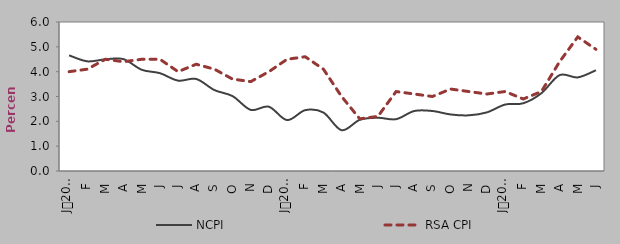
| Category | NCPI | RSA CPI |
|---|---|---|
| 0 | 4.658 | 4 |
| 1900-01-01 | 4.416 | 4.1 |
| 1900-01-02 | 4.498 | 4.5 |
| 1900-01-03 | 4.503 | 4.4 |
| 1900-01-04 | 4.076 | 4.5 |
| 1900-01-05 | 3.939 | 4.5 |
| 1900-01-06 | 3.639 | 4 |
| 1900-01-07 | 3.705 | 4.3 |
| 1900-01-08 | 3.259 | 4.1 |
| 1900-01-09 | 3.015 | 3.7 |
| 1900-01-10 | 2.461 | 3.6 |
| 1900-01-11 | 2.588 | 4 |
| 1900-01-12 | 2.05 | 4.5 |
| 1900-01-13 | 2.45 | 4.6 |
| 1900-01-14 | 2.354 | 4.1 |
| 1900-01-15 | 1.643 | 3 |
| 1900-01-16 | 2.06 | 2.1 |
| 1900-01-17 | 2.145 | 2.2 |
| 1900-01-18 | 2.087 | 3.2 |
| 1900-01-19 | 2.416 | 3.1 |
| 1900-01-20 | 2.416 | 3 |
| 1900-01-21 | 2.277 | 3.3 |
| 1900-01-22 | 2.242 | 3.2 |
| 1900-01-23 | 2.361 | 3.1 |
| 1900-01-24 | 2.676 | 3.2 |
| 1900-01-25 | 2.728 | 2.9 |
| 1900-01-26 | 3.133 | 3.2 |
| 1900-01-27 | 3.861 | 4.4 |
| 1900-01-28 | 3.769 | 5.4 |
| 1900-01-29 | 4.057 | 4.9 |